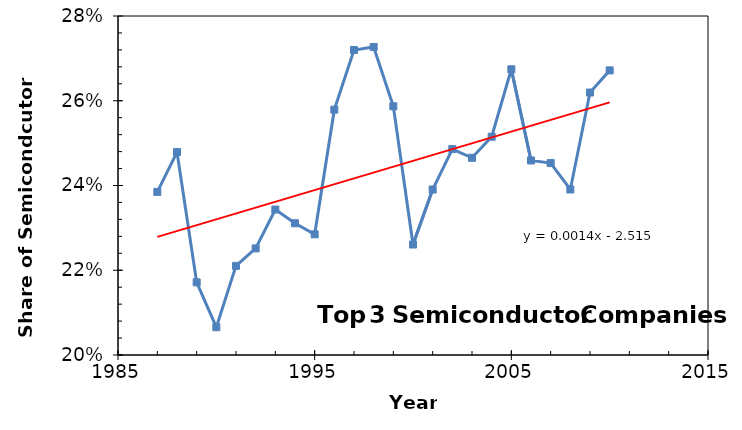
| Category | Series 0 |
|---|---|
| 1987.0 | 0.238 |
| 1988.0 | 0.248 |
| 1989.0 | 0.217 |
| 1990.0 | 0.207 |
| 1991.0 | 0.221 |
| 1992.0 | 0.225 |
| 1993.0 | 0.234 |
| 1994.0 | 0.231 |
| 1995.0 | 0.228 |
| 1996.0 | 0.258 |
| 1997.0 | 0.272 |
| 1998.0 | 0.273 |
| 1999.0 | 0.259 |
| 2000.0 | 0.226 |
| 2001.0 | 0.239 |
| 2002.0 | 0.249 |
| 2003.0 | 0.247 |
| 2004.0 | 0.252 |
| 2005.0 | 0.267 |
| 2006.0 | 0.246 |
| 2007.0 | 0.245 |
| 2008.0 | 0.239 |
| 2009.0 | 0.262 |
| 2010.0 | 0.267 |